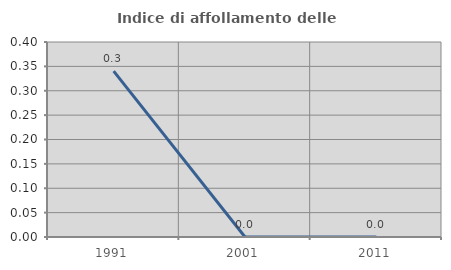
| Category | Indice di affollamento delle abitazioni  |
|---|---|
| 1991.0 | 0.34 |
| 2001.0 | 0 |
| 2011.0 | 0 |